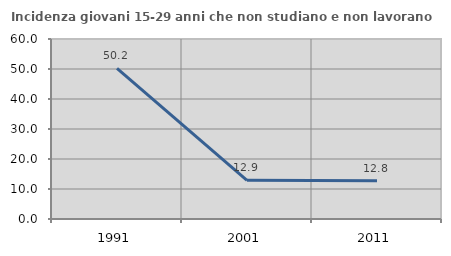
| Category | Incidenza giovani 15-29 anni che non studiano e non lavorano  |
|---|---|
| 1991.0 | 50.185 |
| 2001.0 | 12.903 |
| 2011.0 | 12.791 |